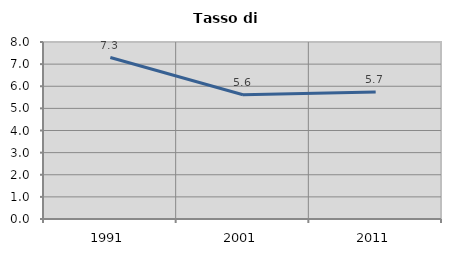
| Category | Tasso di disoccupazione   |
|---|---|
| 1991.0 | 7.299 |
| 2001.0 | 5.618 |
| 2011.0 | 5.736 |